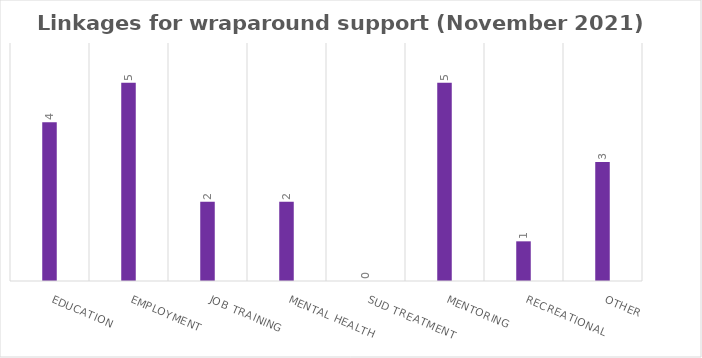
| Category | Series 0 |
|---|---|
| Education | 4 |
| Employment | 5 |
| Job Training | 2 |
| Mental Health | 2 |
| SUD Treatment | 0 |
| Mentoring | 5 |
| Recreational | 1 |
| Other | 3 |